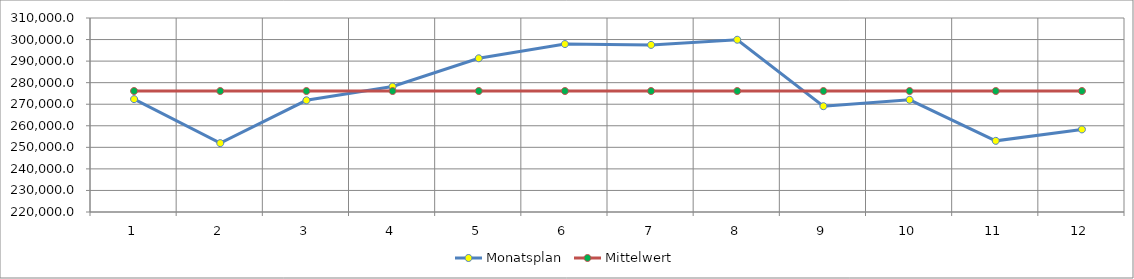
| Category | Monatsplan | Mittelwert |
|---|---|---|
| 0 | 272361 | 276120 |
| 1 | 251948 | 276120 |
| 2 | 271811 | 276120 |
| 3 | 278218 | 276120 |
| 4 | 291309 | 276120 |
| 5 | 297914 | 276120 |
| 6 | 297520 | 276120 |
| 7 | 299910 | 276120 |
| 8 | 269085 | 276120 |
| 9 | 272049 | 276120 |
| 10 | 253005 | 276120 |
| 11 | 258313.53 | 276120 |